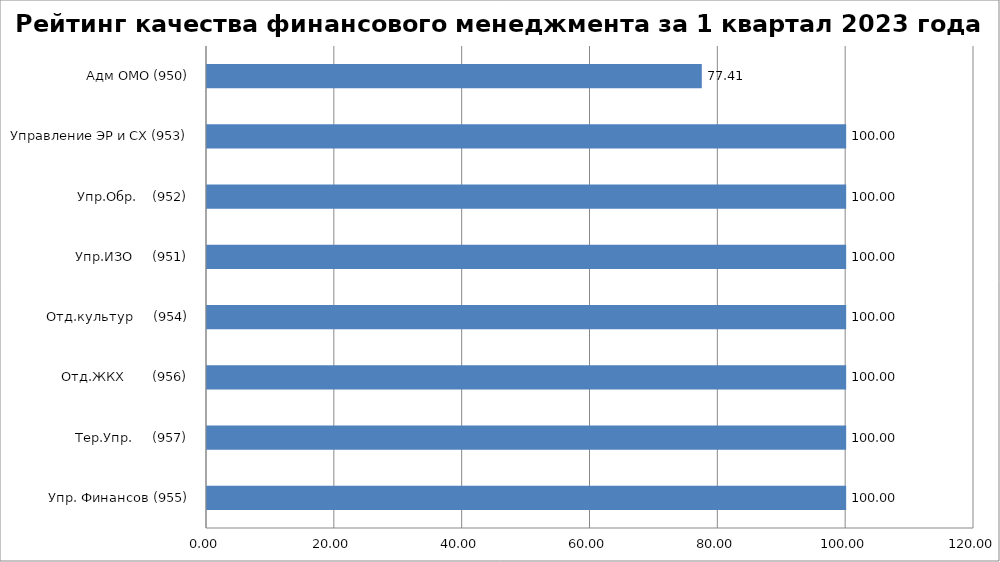
| Category | Series 0 |
|---|---|
| Упр. Финансов (955) | 100 |
| Тер.Упр.     (957) | 100 |
| Отд.ЖКХ       (956) | 100 |
| Отд.культур     (954) | 100 |
| Упр.ИЗО     (951) | 100 |
| Упр.Обр.    (952) | 100 |
| Управление ЭР и СХ (953) | 100 |
| Адм ОМО (950) | 77.412 |